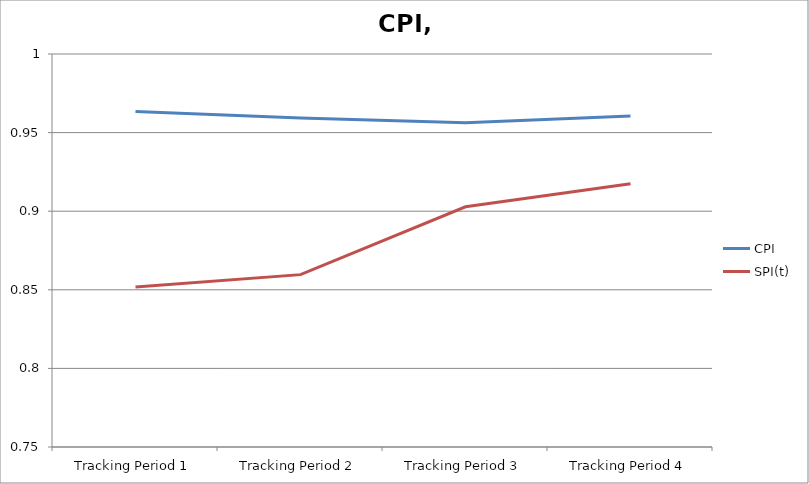
| Category | CPI | SPI(t) |
|---|---|---|
| Tracking Period 1 | 0.963 | 0.852 |
| Tracking Period 2 | 0.959 | 0.86 |
| Tracking Period 3 | 0.956 | 0.903 |
| Tracking Period 4 | 0.961 | 0.918 |